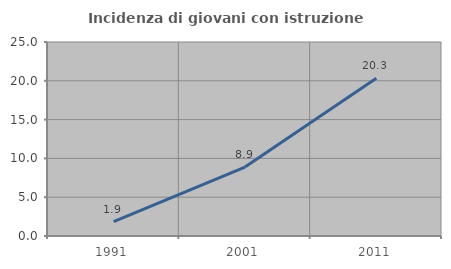
| Category | Incidenza di giovani con istruzione universitaria |
|---|---|
| 1991.0 | 1.865 |
| 2001.0 | 8.886 |
| 2011.0 | 20.343 |